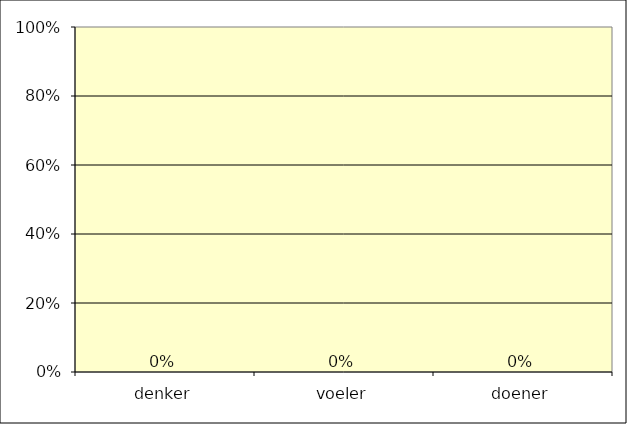
| Category | Series 0 |
|---|---|
| denker | 0 |
| voeler | 0 |
| doener | 0 |